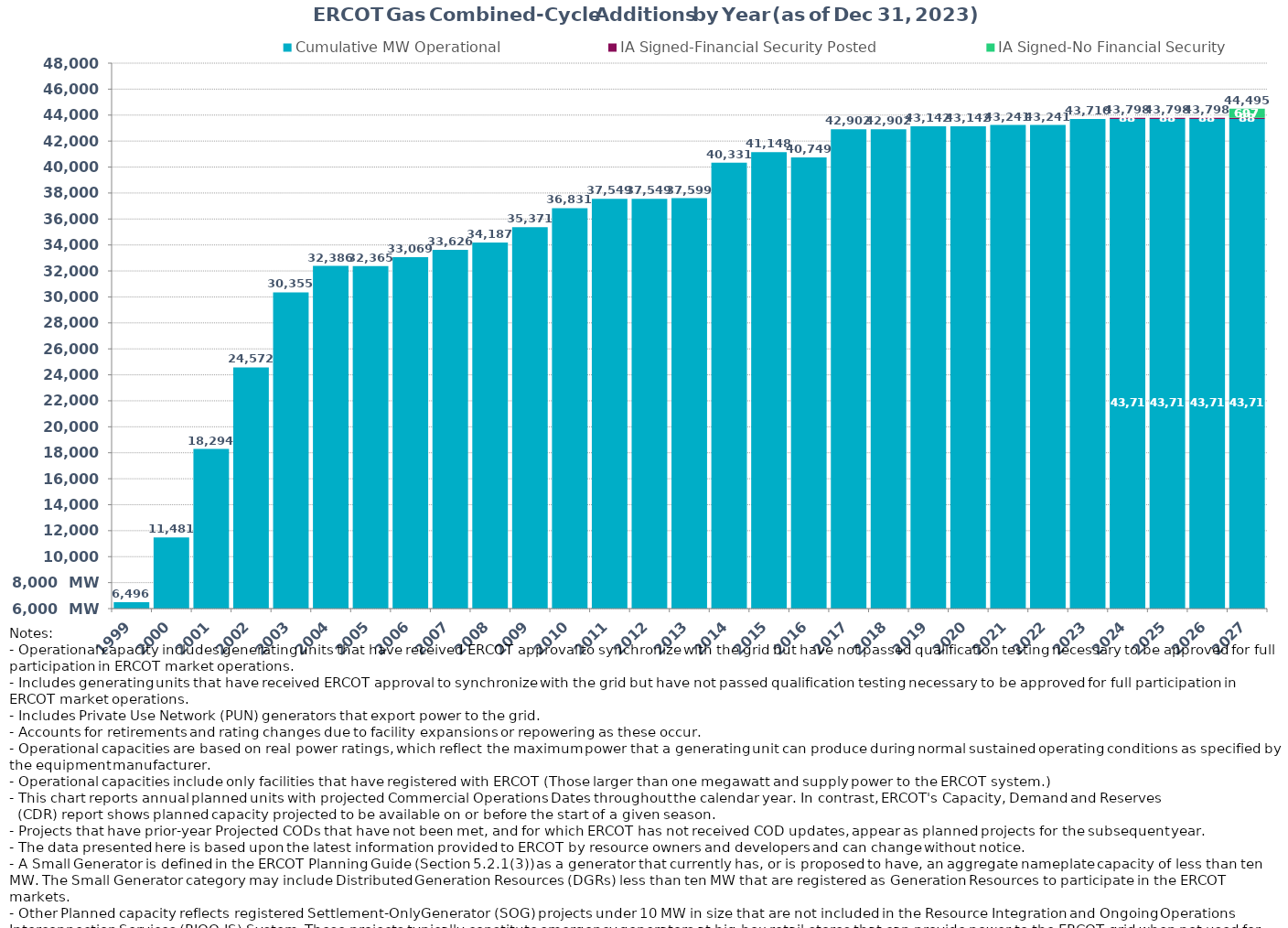
| Category | Cumulative MW Operational | IA Signed-Financial Security Posted  | IA Signed-No Financial Security  | Other Planned | Cumulative Installed and Planned |
|---|---|---|---|---|---|
| 1999.0 | 6496.189 | 0 | 0 | 0 | 6496.189 |
| 2000.0 | 11480.519 | 0 | 0 | 0 | 11480.519 |
| 2001.0 | 18293.659 | 0 | 0 | 0 | 18293.659 |
| 2002.0 | 24571.899 | 0 | 0 | 0 | 24571.899 |
| 2003.0 | 30354.999 | 0 | 0 | 0 | 30354.999 |
| 2004.0 | 32385.519 | 0 | 0 | 0 | 32385.519 |
| 2005.0 | 32364.619 | 0 | 0 | 0 | 32364.619 |
| 2006.0 | 33068.819 | 0 | 0 | 0 | 33068.819 |
| 2007.0 | 33626.119 | 0 | 0 | 0 | 33626.119 |
| 2008.0 | 34187.219 | 0 | 0 | 0 | 34187.219 |
| 2009.0 | 35370.599 | 0 | 0 | 0 | 35370.599 |
| 2010.0 | 36830.799 | 0 | 0 | 0 | 36830.799 |
| 2011.0 | 37549.199 | 0 | 0 | 0 | 37549.199 |
| 2012.0 | 37549.199 | 0 | 0 | 0 | 37549.199 |
| 2013.0 | 37599.199 | 0 | 0 | 0 | 37599.199 |
| 2014.0 | 40330.999 | 0 | 0 | 0 | 40330.999 |
| 2015.0 | 41148.099 | 0 | 0 | 0 | 41148.099 |
| 2016.0 | 40749.109 | 0 | 0 | 0 | 40749.109 |
| 2017.0 | 42901.609 | 0 | 0 | 0 | 42901.609 |
| 2018.0 | 42901.609 | 0 | 0 | 0 | 42901.609 |
| 2019.0 | 43142.009 | 0 | 0 | 0 | 43142.009 |
| 2020.0 | 43142.009 | 0 | 0 | 0 | 43142.009 |
| 2021.0 | 43240.909 | 0 | 0 | 0 | 43240.909 |
| 2022.0 | 43240.909 | 0 | 0 | 0 | 43240.909 |
| 2023.0 | 43709.709 | 0 | 0 | 0 | 43709.709 |
| 2024.0 | 43709.709 | 88 | 0 | 0 | 43797.709 |
| 2025.0 | 43709.709 | 88 | 0 | 0 | 43797.709 |
| 2026.0 | 43709.709 | 88 | 0 | 0 | 43797.709 |
| 2027.0 | 43709.709 | 88 | 697 | 0 | 44494.709 |